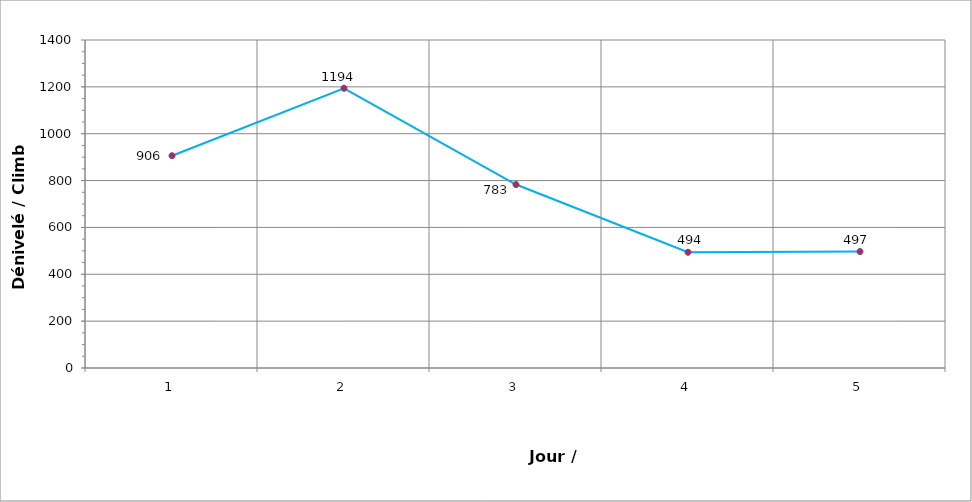
| Category | Series 0 |
|---|---|
| 0 | 906 |
| 1 | 1194 |
| 2 | 783 |
| 3 | 494 |
| 4 | 497 |